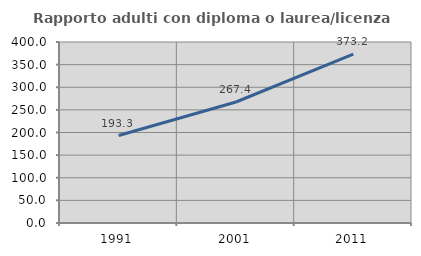
| Category | Rapporto adulti con diploma o laurea/licenza media  |
|---|---|
| 1991.0 | 193.329 |
| 2001.0 | 267.394 |
| 2011.0 | 373.218 |